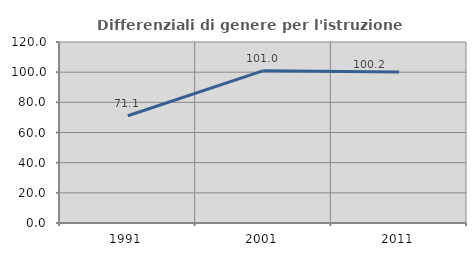
| Category | Differenziali di genere per l'istruzione superiore |
|---|---|
| 1991.0 | 71.084 |
| 2001.0 | 101.01 |
| 2011.0 | 100.182 |